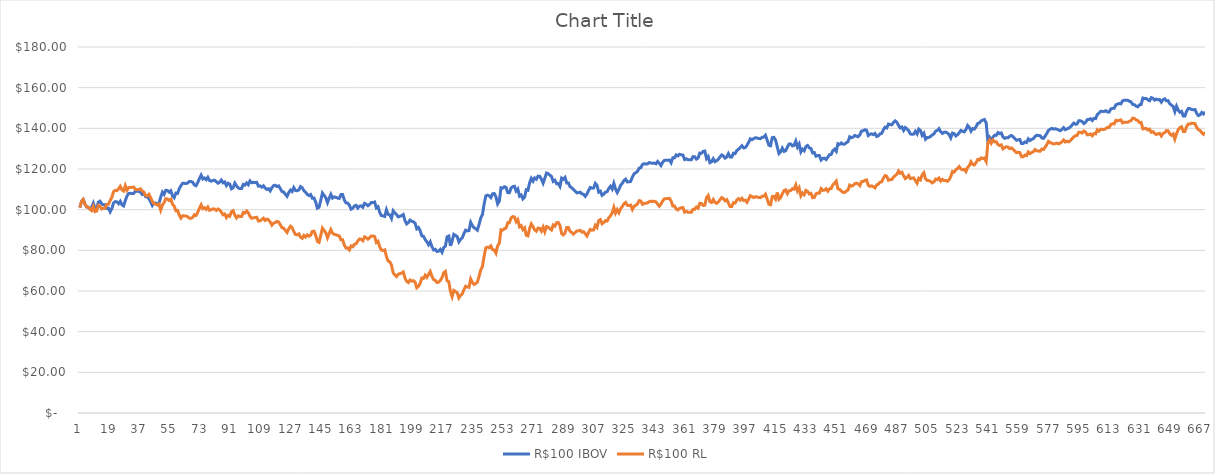
| Category | R$100 IBOV | R$100 RL |
|---|---|---|
| 0 | 101.019 | 101.019 |
| 1 | 104.064 | 104.064 |
| 2 | 105.035 | 105.035 |
| 3 | 102.826 | 102.826 |
| 4 | 101.393 | 101.393 |
| 5 | 101.189 | 101.189 |
| 6 | 100.365 | 100.365 |
| 7 | 101.163 | 99.568 |
| 8 | 103.226 | 101.631 |
| 9 | 100.658 | 99.063 |
| 10 | 100.907 | 99.312 |
| 11 | 103.72 | 102.125 |
| 12 | 104.165 | 101.68 |
| 13 | 102.814 | 100.329 |
| 14 | 102.408 | 100.735 |
| 15 | 102.437 | 100.706 |
| 16 | 100.593 | 102.55 |
| 17 | 100.734 | 102.691 |
| 18 | 98.946 | 104.479 |
| 19 | 100.529 | 106.063 |
| 20 | 103.285 | 108.818 |
| 21 | 103.973 | 109.507 |
| 22 | 103.837 | 109.371 |
| 23 | 102.94 | 110.268 |
| 24 | 104.151 | 111.48 |
| 25 | 102.383 | 109.712 |
| 26 | 101.826 | 109.155 |
| 27 | 104.507 | 111.836 |
| 28 | 106.734 | 109.609 |
| 29 | 108.005 | 110.881 |
| 30 | 108.033 | 110.908 |
| 31 | 107.923 | 111.017 |
| 32 | 108.007 | 111.101 |
| 33 | 109.164 | 109.945 |
| 34 | 109.042 | 109.823 |
| 35 | 108.946 | 109.92 |
| 36 | 108.602 | 110.264 |
| 37 | 107.512 | 109.174 |
| 38 | 108.067 | 108.619 |
| 39 | 106.438 | 106.99 |
| 40 | 106.234 | 106.786 |
| 41 | 105.471 | 107.548 |
| 42 | 103.87 | 105.948 |
| 43 | 102.065 | 104.142 |
| 44 | 103.334 | 102.873 |
| 45 | 103.281 | 102.82 |
| 46 | 102.7 | 102.239 |
| 47 | 103.219 | 102.757 |
| 48 | 106.16 | 99.815 |
| 49 | 108.628 | 102.283 |
| 50 | 107.518 | 103.393 |
| 51 | 109.506 | 105.381 |
| 52 | 109.393 | 105.268 |
| 53 | 108.618 | 104.493 |
| 54 | 109.302 | 105.177 |
| 55 | 106.837 | 102.712 |
| 56 | 105.878 | 101.754 |
| 57 | 108.17 | 99.462 |
| 58 | 107.989 | 99.643 |
| 59 | 110.28 | 97.352 |
| 60 | 111.811 | 95.821 |
| 61 | 112.967 | 96.977 |
| 62 | 112.952 | 96.962 |
| 63 | 112.825 | 96.836 |
| 64 | 113.09 | 96.571 |
| 65 | 113.854 | 95.807 |
| 66 | 113.902 | 95.759 |
| 67 | 113.455 | 96.205 |
| 68 | 112.14 | 97.52 |
| 69 | 111.781 | 97.161 |
| 70 | 113.373 | 98.753 |
| 71 | 115.329 | 100.708 |
| 72 | 116.961 | 102.341 |
| 73 | 115.09 | 100.47 |
| 74 | 115.588 | 100.968 |
| 75 | 114.716 | 100.096 |
| 76 | 115.933 | 101.313 |
| 77 | 114.298 | 99.678 |
| 78 | 113.979 | 99.997 |
| 79 | 114.38 | 100.397 |
| 80 | 114.464 | 100.313 |
| 81 | 113.756 | 99.605 |
| 82 | 113.016 | 100.345 |
| 83 | 113.522 | 99.839 |
| 84 | 114.567 | 98.794 |
| 85 | 113.233 | 97.461 |
| 86 | 113.66 | 97.887 |
| 87 | 111.867 | 96.095 |
| 88 | 112.997 | 97.225 |
| 89 | 112.518 | 96.745 |
| 90 | 110.265 | 98.998 |
| 91 | 110.778 | 99.512 |
| 92 | 113.051 | 97.239 |
| 93 | 111.736 | 95.925 |
| 94 | 110.709 | 96.952 |
| 95 | 110.401 | 96.645 |
| 96 | 110.412 | 96.633 |
| 97 | 112.419 | 98.64 |
| 98 | 112.072 | 98.293 |
| 99 | 113.133 | 99.355 |
| 100 | 112.29 | 98.511 |
| 101 | 114.149 | 96.652 |
| 102 | 113.246 | 95.748 |
| 103 | 113.46 | 95.962 |
| 104 | 113.289 | 96.133 |
| 105 | 113.421 | 96.265 |
| 106 | 111.564 | 94.408 |
| 107 | 111.69 | 94.535 |
| 108 | 111.082 | 95.143 |
| 109 | 111.742 | 95.803 |
| 110 | 110.636 | 94.698 |
| 111 | 109.932 | 95.402 |
| 112 | 110.306 | 95.028 |
| 113 | 109.232 | 93.954 |
| 114 | 110.794 | 92.392 |
| 115 | 111.798 | 93.396 |
| 116 | 112.024 | 93.622 |
| 117 | 111.391 | 94.255 |
| 118 | 111.709 | 93.937 |
| 119 | 110.337 | 92.566 |
| 120 | 108.919 | 91.148 |
| 121 | 108.675 | 90.904 |
| 122 | 107.591 | 89.82 |
| 123 | 106.556 | 88.784 |
| 124 | 108.332 | 90.561 |
| 125 | 109.629 | 91.857 |
| 126 | 108.936 | 91.165 |
| 127 | 110.876 | 89.225 |
| 128 | 109.447 | 87.796 |
| 129 | 109.287 | 87.636 |
| 130 | 109.745 | 88.094 |
| 131 | 111.342 | 86.496 |
| 132 | 110.773 | 85.927 |
| 133 | 109.379 | 87.321 |
| 134 | 108.598 | 86.539 |
| 135 | 107.552 | 87.585 |
| 136 | 106.94 | 86.972 |
| 137 | 107.435 | 87.468 |
| 138 | 105.617 | 89.287 |
| 139 | 105.747 | 89.418 |
| 140 | 103.756 | 87.426 |
| 141 | 100.729 | 84.399 |
| 142 | 101.2 | 83.928 |
| 143 | 104.552 | 87.279 |
| 144 | 108.195 | 90.922 |
| 145 | 107.019 | 89.746 |
| 146 | 105.899 | 88.627 |
| 147 | 103.435 | 86.162 |
| 148 | 105.605 | 88.333 |
| 149 | 107.546 | 90.274 |
| 150 | 105.714 | 88.441 |
| 151 | 106.282 | 87.874 |
| 152 | 106.057 | 87.649 |
| 153 | 105.729 | 87.321 |
| 154 | 105.508 | 87.1 |
| 155 | 107.406 | 85.201 |
| 156 | 107.402 | 85.197 |
| 157 | 104.751 | 82.546 |
| 158 | 103.325 | 81.12 |
| 159 | 103.22 | 81.226 |
| 160 | 102.202 | 80.208 |
| 161 | 100.252 | 82.158 |
| 162 | 100.65 | 81.759 |
| 163 | 101.852 | 82.961 |
| 164 | 102.139 | 83.249 |
| 165 | 100.761 | 84.627 |
| 166 | 101.726 | 85.593 |
| 167 | 101.885 | 85.434 |
| 168 | 101.169 | 84.718 |
| 169 | 103.088 | 86.637 |
| 170 | 102.703 | 86.252 |
| 171 | 101.921 | 85.469 |
| 172 | 102.63 | 86.179 |
| 173 | 103.486 | 87.035 |
| 174 | 103.509 | 87.057 |
| 175 | 103.787 | 86.779 |
| 176 | 100.852 | 83.844 |
| 177 | 101.448 | 84.44 |
| 178 | 98.748 | 81.74 |
| 179 | 97.106 | 80.098 |
| 180 | 96.944 | 79.936 |
| 181 | 96.651 | 80.229 |
| 182 | 99.942 | 76.939 |
| 183 | 97.718 | 74.714 |
| 184 | 97.413 | 74.41 |
| 185 | 95.689 | 72.685 |
| 186 | 99.435 | 68.939 |
| 187 | 98.4 | 67.904 |
| 188 | 97.594 | 67.098 |
| 189 | 96.454 | 68.238 |
| 190 | 96.733 | 68.517 |
| 191 | 97.054 | 68.838 |
| 192 | 97.598 | 69.382 |
| 193 | 94.616 | 66.4 |
| 194 | 92.997 | 64.78 |
| 195 | 93.622 | 64.155 |
| 196 | 94.875 | 65.409 |
| 197 | 94.305 | 64.839 |
| 198 | 94.054 | 65.09 |
| 199 | 93.357 | 64.394 |
| 200 | 90.568 | 61.605 |
| 201 | 91.228 | 62.265 |
| 202 | 89.705 | 63.788 |
| 203 | 87.125 | 66.368 |
| 204 | 86.921 | 66.164 |
| 205 | 85.29 | 67.794 |
| 206 | 84.199 | 66.703 |
| 207 | 82.757 | 68.145 |
| 208 | 84.184 | 69.573 |
| 209 | 81.827 | 67.216 |
| 210 | 80.189 | 65.578 |
| 211 | 80.505 | 65.261 |
| 212 | 79.422 | 64.179 |
| 213 | 79.614 | 64.37 |
| 214 | 80.446 | 65.202 |
| 215 | 79.042 | 66.607 |
| 216 | 81.386 | 68.951 |
| 217 | 82.048 | 69.613 |
| 218 | 86.646 | 65.015 |
| 219 | 87.051 | 64.609 |
| 220 | 82.186 | 59.744 |
| 221 | 84.759 | 57.171 |
| 222 | 87.873 | 60.285 |
| 223 | 87.31 | 59.722 |
| 224 | 86.78 | 59.192 |
| 225 | 84.157 | 56.569 |
| 226 | 85.404 | 57.816 |
| 227 | 86.119 | 58.532 |
| 228 | 88.252 | 60.664 |
| 229 | 89.92 | 62.332 |
| 230 | 89.552 | 61.965 |
| 231 | 89.709 | 61.808 |
| 232 | 93.782 | 65.881 |
| 233 | 92.131 | 64.229 |
| 234 | 91.105 | 63.204 |
| 235 | 90.637 | 63.672 |
| 236 | 89.933 | 64.376 |
| 237 | 92.82 | 67.264 |
| 238 | 95.924 | 70.367 |
| 239 | 97.671 | 72.114 |
| 240 | 102.794 | 77.238 |
| 241 | 106.803 | 81.247 |
| 242 | 107.131 | 81.575 |
| 243 | 106.839 | 81.282 |
| 244 | 105.949 | 82.172 |
| 245 | 107.811 | 80.311 |
| 246 | 107.948 | 80.174 |
| 247 | 106.393 | 78.618 |
| 248 | 102.838 | 82.173 |
| 249 | 104.181 | 83.516 |
| 250 | 110.778 | 90.113 |
| 251 | 110.584 | 89.919 |
| 252 | 111.286 | 90.621 |
| 253 | 110.97 | 90.938 |
| 254 | 108.382 | 93.526 |
| 255 | 108.316 | 93.592 |
| 256 | 110.694 | 95.97 |
| 257 | 111.318 | 96.594 |
| 258 | 111.501 | 96.41 |
| 259 | 109.172 | 94.08 |
| 260 | 110.184 | 95.093 |
| 261 | 106.66 | 91.569 |
| 262 | 107.222 | 92.13 |
| 263 | 105.269 | 90.177 |
| 264 | 106.136 | 91.045 |
| 265 | 109.805 | 87.375 |
| 266 | 109.55 | 87.121 |
| 267 | 113.212 | 90.783 |
| 268 | 115.42 | 92.99 |
| 269 | 114.03 | 91.6 |
| 270 | 115.588 | 90.041 |
| 271 | 114.961 | 89.414 |
| 272 | 116.504 | 90.956 |
| 273 | 116.357 | 90.809 |
| 274 | 115.008 | 89.461 |
| 275 | 113.031 | 91.438 |
| 276 | 115.386 | 89.084 |
| 277 | 118.014 | 91.712 |
| 278 | 117.709 | 91.407 |
| 279 | 116.971 | 90.669 |
| 280 | 116.323 | 90.021 |
| 281 | 113.892 | 92.452 |
| 282 | 114.453 | 91.892 |
| 283 | 112.775 | 93.57 |
| 284 | 112.866 | 93.661 |
| 285 | 111.458 | 92.253 |
| 286 | 115.539 | 88.172 |
| 287 | 114.961 | 87.594 |
| 288 | 115.865 | 88.498 |
| 289 | 113.166 | 91.197 |
| 290 | 113.164 | 91.199 |
| 291 | 111.303 | 89.338 |
| 292 | 110.758 | 88.793 |
| 293 | 109.91 | 87.944 |
| 294 | 109.092 | 88.762 |
| 295 | 108.302 | 89.553 |
| 296 | 108.332 | 89.583 |
| 297 | 108.612 | 89.863 |
| 298 | 107.739 | 88.99 |
| 299 | 107.561 | 89.167 |
| 300 | 106.556 | 88.162 |
| 301 | 107.672 | 87.046 |
| 302 | 109.456 | 88.829 |
| 303 | 110.923 | 90.297 |
| 304 | 110.554 | 89.927 |
| 305 | 110.665 | 90.038 |
| 306 | 112.925 | 92.298 |
| 307 | 111.935 | 91.308 |
| 308 | 108.617 | 94.626 |
| 309 | 109.101 | 95.11 |
| 310 | 107.061 | 93.07 |
| 311 | 107.61 | 93.619 |
| 312 | 108.626 | 94.635 |
| 313 | 108.873 | 94.388 |
| 314 | 110.478 | 95.993 |
| 315 | 111.489 | 97.004 |
| 316 | 110.147 | 98.346 |
| 317 | 112.947 | 101.145 |
| 318 | 110.125 | 98.323 |
| 319 | 108.41 | 100.037 |
| 320 | 109.956 | 98.492 |
| 321 | 111.945 | 100.482 |
| 322 | 112.975 | 101.511 |
| 323 | 114.345 | 102.881 |
| 324 | 114.988 | 103.525 |
| 325 | 113.605 | 102.142 |
| 326 | 113.721 | 102.026 |
| 327 | 113.939 | 102.244 |
| 328 | 116.103 | 100.079 |
| 329 | 117.645 | 101.62 |
| 330 | 118.193 | 102.169 |
| 331 | 118.823 | 102.799 |
| 332 | 120.441 | 104.416 |
| 333 | 120.616 | 104.241 |
| 334 | 122.246 | 102.611 |
| 335 | 122.625 | 102.99 |
| 336 | 122.413 | 103.202 |
| 337 | 122.524 | 103.313 |
| 338 | 123.162 | 103.951 |
| 339 | 122.935 | 104.177 |
| 340 | 122.777 | 104.019 |
| 341 | 122.9 | 104.142 |
| 342 | 122.573 | 103.815 |
| 343 | 123.704 | 102.684 |
| 344 | 122.741 | 101.72 |
| 345 | 121.695 | 102.767 |
| 346 | 123.324 | 104.396 |
| 347 | 124.23 | 105.302 |
| 348 | 124.346 | 105.418 |
| 349 | 124.301 | 105.463 |
| 350 | 124.394 | 105.557 |
| 351 | 123.061 | 104.224 |
| 352 | 125.486 | 101.8 |
| 353 | 125.482 | 101.796 |
| 354 | 126.937 | 100.342 |
| 355 | 126.445 | 99.85 |
| 356 | 127.242 | 100.646 |
| 357 | 126.976 | 100.913 |
| 358 | 126.862 | 101.026 |
| 359 | 124.632 | 98.796 |
| 360 | 125.046 | 99.209 |
| 361 | 124.525 | 98.689 |
| 362 | 124.532 | 98.682 |
| 363 | 124.522 | 98.672 |
| 364 | 126.071 | 100.221 |
| 365 | 126.011 | 100.161 |
| 366 | 124.86 | 101.312 |
| 367 | 125.439 | 100.733 |
| 368 | 127.809 | 103.103 |
| 369 | 127.725 | 103.019 |
| 370 | 128.67 | 102.074 |
| 371 | 128.841 | 102.245 |
| 372 | 125.136 | 105.951 |
| 373 | 126.146 | 106.961 |
| 374 | 123.133 | 103.948 |
| 375 | 123.552 | 103.529 |
| 376 | 125.042 | 105.019 |
| 377 | 123.61 | 103.588 |
| 378 | 124.083 | 103.115 |
| 379 | 124.756 | 103.788 |
| 380 | 125.896 | 104.927 |
| 381 | 126.924 | 105.955 |
| 382 | 126.42 | 105.451 |
| 383 | 125.325 | 104.356 |
| 384 | 125.89 | 104.921 |
| 385 | 127.558 | 103.253 |
| 386 | 125.865 | 101.559 |
| 387 | 125.892 | 101.587 |
| 388 | 127.767 | 103.461 |
| 389 | 127.561 | 103.256 |
| 390 | 129.103 | 104.798 |
| 391 | 129.751 | 105.445 |
| 392 | 130.517 | 104.678 |
| 393 | 131.432 | 105.593 |
| 394 | 130.385 | 104.546 |
| 395 | 130.544 | 104.705 |
| 396 | 131.604 | 103.644 |
| 397 | 133.108 | 105.148 |
| 398 | 134.84 | 106.881 |
| 399 | 134.407 | 106.448 |
| 400 | 134.93 | 105.925 |
| 401 | 135.353 | 106.348 |
| 402 | 135.278 | 106.273 |
| 403 | 134.975 | 105.97 |
| 404 | 134.913 | 105.908 |
| 405 | 135.577 | 106.572 |
| 406 | 135.667 | 106.662 |
| 407 | 136.627 | 107.622 |
| 408 | 134.164 | 105.159 |
| 409 | 131.675 | 102.67 |
| 410 | 131.429 | 102.424 |
| 411 | 135.413 | 106.408 |
| 412 | 135.578 | 106.573 |
| 413 | 134.176 | 105.171 |
| 414 | 130.924 | 108.422 |
| 415 | 127.628 | 105.127 |
| 416 | 128.427 | 105.926 |
| 417 | 130.275 | 107.773 |
| 418 | 128.647 | 109.401 |
| 419 | 128.968 | 109.722 |
| 420 | 130.816 | 107.874 |
| 421 | 132.263 | 109.322 |
| 422 | 132.315 | 109.373 |
| 423 | 131.363 | 110.325 |
| 424 | 131.629 | 110.06 |
| 425 | 133.734 | 112.165 |
| 426 | 130.762 | 109.193 |
| 427 | 132.269 | 110.7 |
| 428 | 128.394 | 106.825 |
| 429 | 129.753 | 108.184 |
| 430 | 128.951 | 107.382 |
| 431 | 131.05 | 109.481 |
| 432 | 131.584 | 108.947 |
| 433 | 130.384 | 107.747 |
| 434 | 130.094 | 108.037 |
| 435 | 127.908 | 105.852 |
| 436 | 128.081 | 106.025 |
| 437 | 126.278 | 107.828 |
| 438 | 126.594 | 108.144 |
| 439 | 126.582 | 108.132 |
| 440 | 124.393 | 110.321 |
| 441 | 125.219 | 109.494 |
| 442 | 125.33 | 109.605 |
| 443 | 124.65 | 110.285 |
| 444 | 125.842 | 109.094 |
| 445 | 127.021 | 110.273 |
| 446 | 127.152 | 110.405 |
| 447 | 129 | 112.253 |
| 448 | 129.745 | 112.997 |
| 449 | 128.685 | 114.057 |
| 450 | 132.419 | 110.323 |
| 451 | 132.055 | 109.959 |
| 452 | 132.838 | 109.176 |
| 453 | 132.184 | 108.522 |
| 454 | 132.241 | 108.465 |
| 455 | 132.941 | 109.166 |
| 456 | 133.446 | 109.671 |
| 457 | 135.861 | 112.086 |
| 458 | 135.389 | 111.614 |
| 459 | 135.67 | 111.895 |
| 460 | 136.489 | 112.714 |
| 461 | 136.172 | 113.031 |
| 462 | 135.862 | 112.721 |
| 463 | 136.753 | 111.83 |
| 464 | 138.657 | 113.733 |
| 465 | 138.795 | 113.871 |
| 466 | 139.328 | 114.404 |
| 467 | 139.091 | 114.642 |
| 468 | 136.468 | 112.019 |
| 469 | 137.042 | 111.445 |
| 470 | 137.297 | 111.7 |
| 471 | 136.899 | 111.302 |
| 472 | 137.481 | 110.72 |
| 473 | 136.002 | 112.199 |
| 474 | 136.324 | 112.521 |
| 475 | 137.315 | 113.512 |
| 476 | 137.515 | 113.712 |
| 477 | 139.301 | 115.498 |
| 478 | 140.575 | 116.773 |
| 479 | 140.195 | 116.392 |
| 480 | 142.088 | 114.499 |
| 481 | 141.85 | 114.737 |
| 482 | 141.752 | 114.834 |
| 483 | 142.911 | 115.993 |
| 484 | 143.668 | 116.751 |
| 485 | 142.999 | 117.42 |
| 486 | 141.353 | 119.066 |
| 487 | 140.169 | 117.881 |
| 488 | 140.659 | 118.372 |
| 489 | 138.966 | 116.679 |
| 490 | 140.38 | 115.265 |
| 491 | 139.714 | 115.932 |
| 492 | 138.811 | 116.834 |
| 493 | 137.253 | 115.277 |
| 494 | 137.048 | 115.482 |
| 495 | 137.187 | 115.622 |
| 496 | 138.515 | 114.293 |
| 497 | 137.241 | 113.019 |
| 498 | 139.615 | 115.393 |
| 499 | 138.933 | 114.711 |
| 500 | 136.542 | 117.102 |
| 501 | 137.591 | 118.152 |
| 502 | 134.657 | 115.217 |
| 503 | 135.516 | 114.358 |
| 504 | 135.532 | 114.374 |
| 505 | 136.04 | 113.866 |
| 506 | 136.751 | 113.155 |
| 507 | 137.267 | 113.671 |
| 508 | 138.641 | 115.045 |
| 509 | 138.99 | 114.695 |
| 510 | 139.846 | 115.551 |
| 511 | 138.335 | 114.04 |
| 512 | 137.483 | 114.892 |
| 513 | 138.059 | 114.316 |
| 514 | 138.147 | 114.404 |
| 515 | 137.698 | 113.956 |
| 516 | 136.971 | 114.683 |
| 517 | 135.303 | 116.351 |
| 518 | 137.705 | 118.753 |
| 519 | 137.431 | 118.479 |
| 520 | 136.259 | 119.652 |
| 521 | 136.817 | 120.21 |
| 522 | 137.802 | 121.195 |
| 523 | 138.981 | 120.016 |
| 524 | 138.542 | 119.577 |
| 525 | 138.257 | 119.862 |
| 526 | 139.379 | 118.74 |
| 527 | 141.396 | 120.756 |
| 528 | 140.455 | 121.698 |
| 529 | 138.592 | 123.56 |
| 530 | 139.898 | 122.254 |
| 531 | 139.618 | 121.974 |
| 532 | 140.766 | 123.122 |
| 533 | 142.383 | 124.739 |
| 534 | 142.662 | 124.46 |
| 535 | 143.675 | 125.473 |
| 536 | 144.044 | 125.104 |
| 537 | 144.351 | 125.41 |
| 538 | 142.686 | 123.745 |
| 539 | 133.886 | 132.544 |
| 540 | 135.578 | 134.236 |
| 541 | 134.036 | 132.693 |
| 542 | 135.639 | 134.297 |
| 543 | 136.589 | 133.347 |
| 544 | 136.541 | 133.395 |
| 545 | 137.899 | 132.038 |
| 546 | 137.393 | 131.532 |
| 547 | 137.708 | 131.848 |
| 548 | 135.752 | 129.892 |
| 549 | 135.079 | 130.565 |
| 550 | 135.436 | 130.921 |
| 551 | 135.338 | 130.823 |
| 552 | 136.147 | 130.015 |
| 553 | 136.49 | 130.358 |
| 554 | 135.833 | 129.701 |
| 555 | 134.965 | 128.832 |
| 556 | 134.143 | 128.011 |
| 557 | 134.352 | 128.22 |
| 558 | 134.504 | 128.068 |
| 559 | 132.492 | 126.056 |
| 560 | 132.485 | 126.049 |
| 561 | 133.325 | 126.888 |
| 562 | 133.023 | 126.587 |
| 563 | 134.825 | 128.389 |
| 564 | 134 | 127.564 |
| 565 | 134.556 | 128.12 |
| 566 | 134.913 | 128.476 |
| 567 | 135.975 | 129.538 |
| 568 | 136.579 | 128.934 |
| 569 | 136.503 | 128.858 |
| 570 | 136.38 | 128.735 |
| 571 | 135.296 | 129.818 |
| 572 | 135.06 | 129.581 |
| 573 | 136.188 | 130.709 |
| 574 | 137.468 | 131.99 |
| 575 | 139.041 | 133.563 |
| 576 | 139.568 | 133.035 |
| 577 | 139.964 | 132.639 |
| 578 | 139.622 | 132.297 |
| 579 | 139.815 | 132.49 |
| 580 | 139.573 | 132.732 |
| 581 | 139.202 | 132.361 |
| 582 | 138.811 | 132.752 |
| 583 | 139.454 | 133.395 |
| 584 | 140.327 | 134.267 |
| 585 | 139.326 | 133.267 |
| 586 | 139.735 | 133.676 |
| 587 | 140.072 | 133.339 |
| 588 | 140.718 | 133.985 |
| 589 | 141.622 | 134.889 |
| 590 | 142.554 | 135.821 |
| 591 | 142.02 | 136.356 |
| 592 | 142.201 | 136.537 |
| 593 | 143.758 | 138.095 |
| 594 | 143.698 | 138.034 |
| 595 | 143.362 | 137.699 |
| 596 | 142.359 | 138.702 |
| 597 | 142.907 | 138.154 |
| 598 | 144.281 | 136.779 |
| 599 | 144.384 | 136.882 |
| 600 | 144.734 | 137.232 |
| 601 | 143.834 | 136.332 |
| 602 | 144.92 | 137.418 |
| 603 | 144.803 | 137.301 |
| 604 | 146.808 | 139.306 |
| 605 | 147.475 | 138.639 |
| 606 | 148.404 | 139.568 |
| 607 | 148.322 | 139.486 |
| 608 | 148.241 | 139.405 |
| 609 | 148.682 | 139.846 |
| 610 | 148.06 | 140.469 |
| 611 | 147.988 | 140.397 |
| 612 | 149.524 | 141.933 |
| 613 | 149.81 | 142.219 |
| 614 | 149.841 | 142.188 |
| 615 | 151.588 | 143.936 |
| 616 | 151.884 | 143.64 |
| 617 | 152.218 | 143.974 |
| 618 | 152.043 | 144.149 |
| 619 | 153.517 | 142.676 |
| 620 | 153.824 | 142.984 |
| 621 | 153.803 | 143.005 |
| 622 | 153.843 | 142.965 |
| 623 | 153.316 | 143.491 |
| 624 | 153.033 | 143.774 |
| 625 | 151.777 | 145.031 |
| 626 | 151.611 | 144.864 |
| 627 | 150.908 | 144.162 |
| 628 | 150.596 | 143.85 |
| 629 | 151.585 | 142.862 |
| 630 | 151.674 | 142.951 |
| 631 | 154.905 | 139.719 |
| 632 | 154.681 | 139.943 |
| 633 | 154.716 | 139.908 |
| 634 | 153.981 | 139.173 |
| 635 | 153.55 | 139.604 |
| 636 | 155.095 | 138.059 |
| 637 | 154.787 | 138.367 |
| 638 | 153.888 | 137.469 |
| 639 | 154.4 | 136.957 |
| 640 | 153.998 | 137.359 |
| 641 | 154.14 | 137.501 |
| 642 | 152.859 | 136.22 |
| 643 | 154.102 | 137.463 |
| 644 | 154.522 | 137.883 |
| 645 | 153.511 | 138.894 |
| 646 | 153.617 | 138.789 |
| 647 | 152.069 | 137.241 |
| 648 | 151.411 | 136.583 |
| 649 | 150.76 | 137.235 |
| 650 | 148.208 | 134.683 |
| 651 | 150.899 | 137.373 |
| 652 | 148.973 | 139.299 |
| 653 | 147.924 | 140.348 |
| 654 | 148.352 | 140.776 |
| 655 | 146.078 | 138.502 |
| 656 | 146.078 | 138.502 |
| 657 | 148.457 | 140.881 |
| 658 | 149.733 | 142.157 |
| 659 | 149.69 | 142.114 |
| 660 | 149.247 | 142.557 |
| 661 | 149.115 | 142.425 |
| 662 | 149.224 | 142.315 |
| 663 | 147.282 | 140.373 |
| 664 | 146.279 | 139.37 |
| 665 | 146.686 | 138.963 |
| 666 | 147.829 | 137.82 |
| 667 | 147.085 | 137.076 |
| 668 | 148.08 | 138.071 |